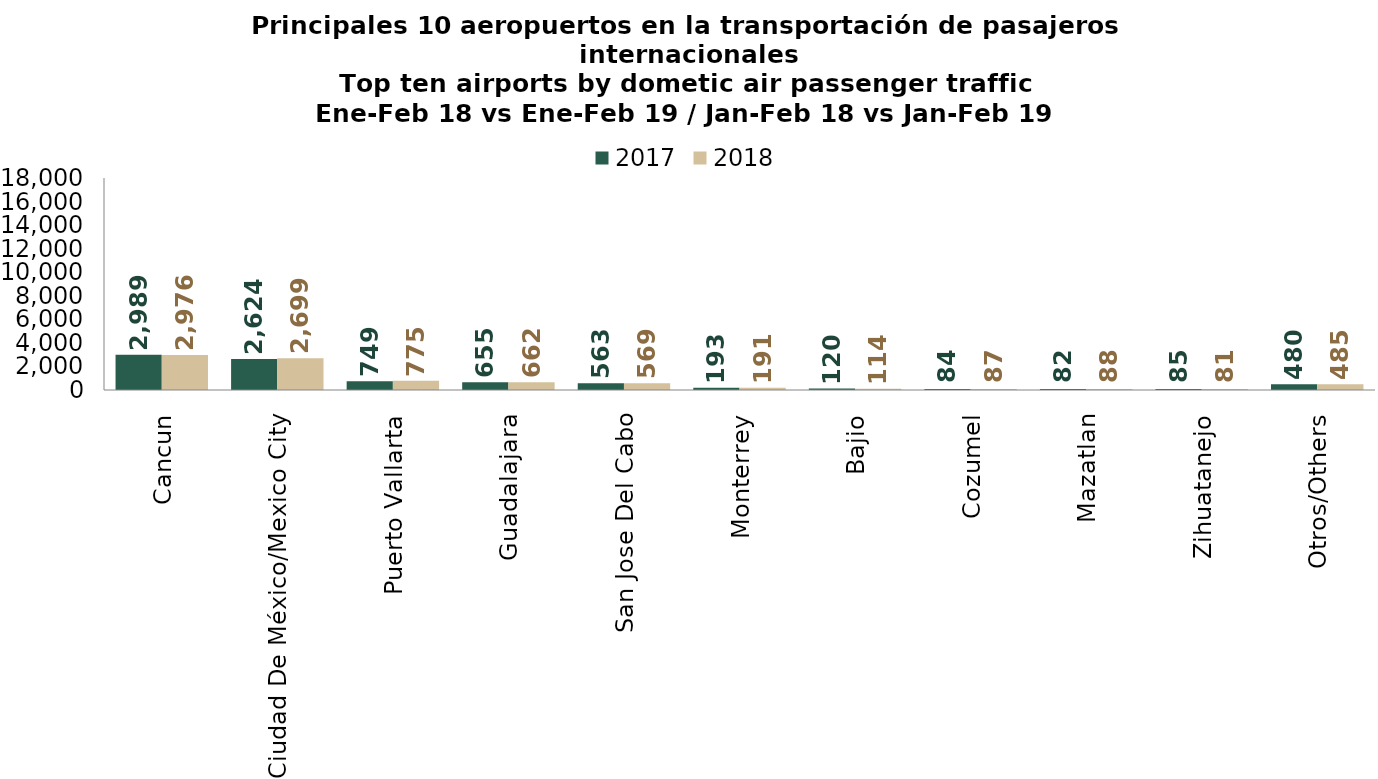
| Category | 2017 | 2018 |
|---|---|---|
| Cancun | 2988.923 | 2976.38 |
| Ciudad De México/Mexico City | 2624.276 | 2699.316 |
| Puerto Vallarta | 749.408 | 774.916 |
| Guadalajara | 654.883 | 661.688 |
| San Jose Del Cabo | 563.472 | 568.766 |
| Monterrey | 192.589 | 190.829 |
| Bajio | 119.705 | 113.939 |
| Cozumel | 83.829 | 86.572 |
| Mazatlan | 82.264 | 87.907 |
| Zihuatanejo | 85.406 | 80.803 |
| Otros/Others | 480.271 | 484.537 |